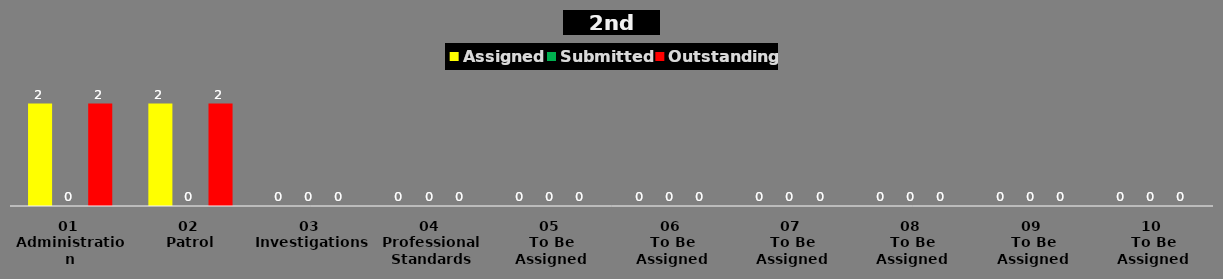
| Category | Assigned | Submitted | Outstanding |
|---|---|---|---|
| 01 
Administration | 2 | 0 | 2 |
| 02 
Patrol | 2 | 0 | 2 |
| 03 
Investigations | 0 | 0 | 0 |
| 04 
Professional Standards | 0 | 0 | 0 |
| 05 
To Be Assigned | 0 | 0 | 0 |
| 06 
To Be Assigned | 0 | 0 | 0 |
| 07 
To Be Assigned | 0 | 0 | 0 |
| 08 
To Be Assigned | 0 | 0 | 0 |
| 09 
To Be Assigned | 0 | 0 | 0 |
| 10 
To Be Assigned | 0 | 0 | 0 |